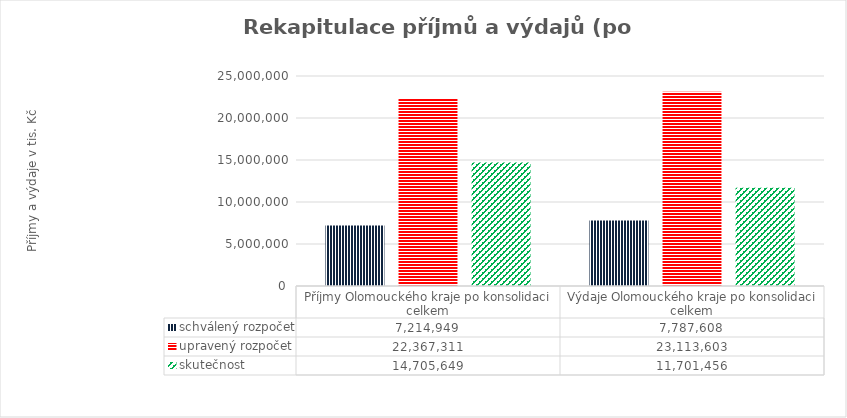
| Category | schválený rozpočet | upravený rozpočet | skutečnost |
|---|---|---|---|
| Příjmy Olomouckého kraje po konsolidaci celkem | 7214949 | 22367311 | 14705649 |
| Výdaje Olomouckého kraje po konsolidaci celkem | 7787608 | 23113603 | 11701456 |